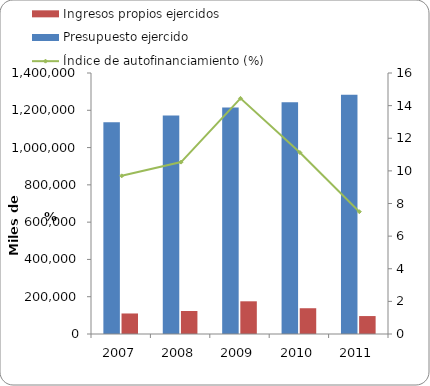
| Category | Presupuesto ejercido | Ingresos propios ejercidos  |
|---|---|---|
| 2007 | 1135618 | 110113 |
| 2008 | 1172131 | 123519 |
| 2009 | 1214312 | 175407 |
| 2010 | 1242620.5 | 138219.5 |
| 2011 | 1283563.8 | 96216.4 |